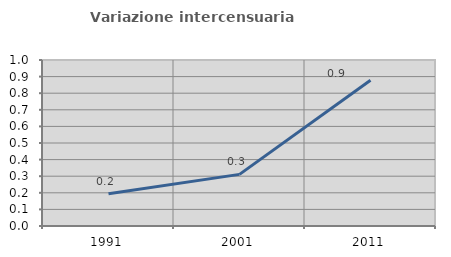
| Category | Variazione intercensuaria annua |
|---|---|
| 1991.0 | 0.195 |
| 2001.0 | 0.311 |
| 2011.0 | 0.878 |